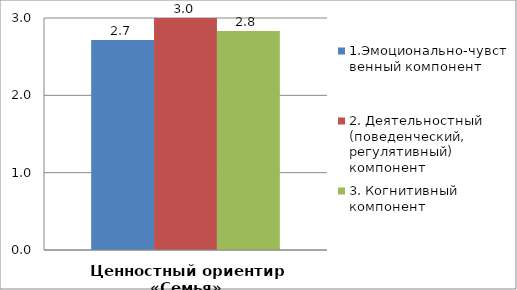
| Category | 1.Эмоционально-чувственный компонент | 2. Деятельностный (поведенческий, регулятивный) компонент | 3. Когнитивный компонент |
|---|---|---|---|
| Ценностный ориентир «Семья» | 2.714 | 3 | 2.833 |